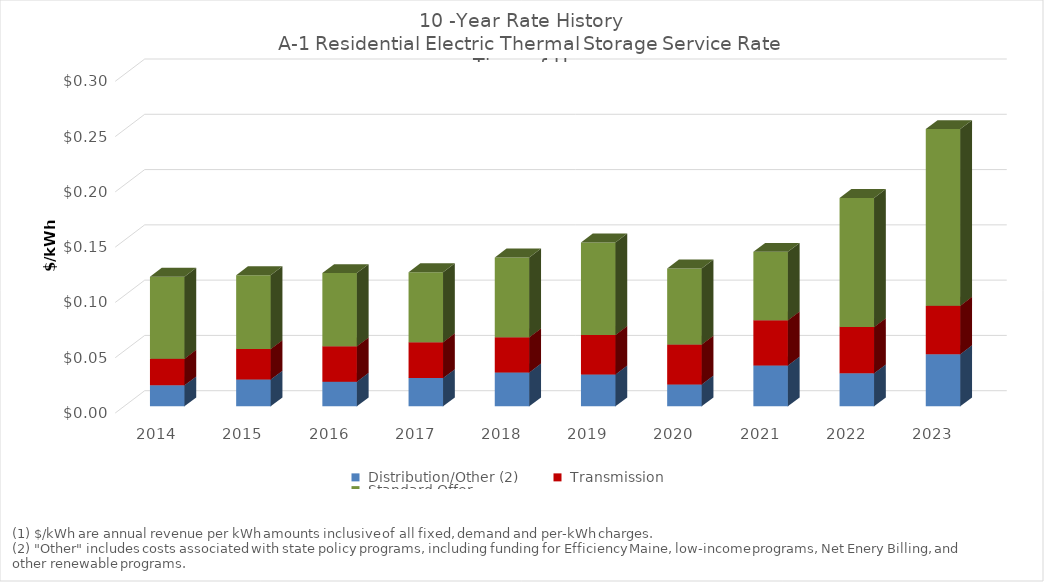
| Category | Series 1 | Series 2 | Series 3 |
|---|---|---|---|
| 2014.0 | 0.019 | 0.024 | 0.074 |
| 2015.0 | 0.024 | 0.028 | 0.067 |
| 2016.0 | 0.022 | 0.032 | 0.066 |
| 2017.0 | 0.026 | 0.033 | 0.063 |
| 2018.0 | 0.031 | 0.032 | 0.072 |
| 2019.0 | 0.029 | 0.036 | 0.084 |
| 2020.0 | 0.02 | 0.036 | 0.069 |
| 2021.0 | 0.037 | 0.041 | 0.062 |
| 2022.0 | 0.03 | 0.042 | 0.117 |
| 2023.0 | 0.047 | 0.044 | 0.16 |